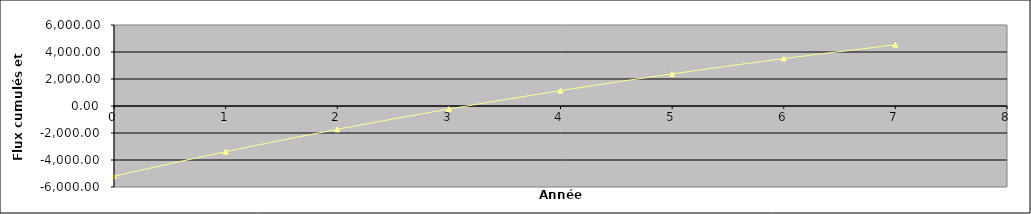
| Category | Flux cumulés et actualisés |
|---|---|
| 0.0 | -5200 |
| 1.0 | -3381.818 |
| 2.0 | -1728.926 |
| 3.0 | -226.296 |
| 4.0 | 1139.731 |
| 5.0 | 2381.574 |
| 6.0 | 3510.521 |
| 7.0 | 4536.838 |